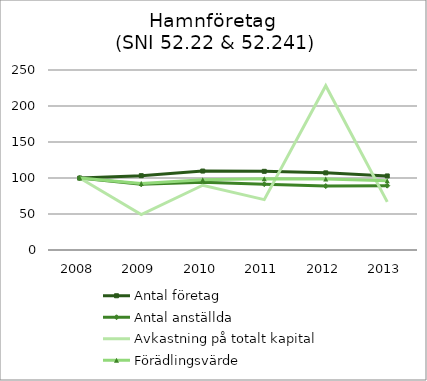
| Category | Antal företag | Antal anställda | Avkastning på totalt kapital | Förädlingsvärde |
|---|---|---|---|---|
| 2008.0 | 100 | 100 | 100 | 100 |
| 2009.0 | 103.214 | 91.221 | 49.138 | 92.29 |
| 2010.0 | 109.643 | 93.976 | 89.934 | 97.426 |
| 2011.0 | 109.286 | 91.437 | 69.936 | 99.066 |
| 2012.0 | 107.143 | 88.765 | 228.146 | 98.612 |
| 2013.0 | 102.857 | 89.363 | 66.878 | 96.054 |